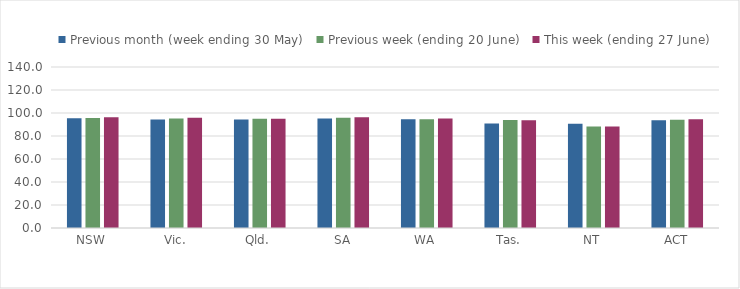
| Category | Previous month (week ending 30 May) | Previous week (ending 20 June) | This week (ending 27 June) |
|---|---|---|---|
| NSW | 95.404 | 95.61 | 96.217 |
| Vic. | 94.378 | 95.317 | 95.972 |
| Qld. | 94.382 | 94.968 | 94.948 |
| SA | 95.183 | 95.962 | 96.258 |
| WA | 94.659 | 94.659 | 95.127 |
| Tas. | 90.877 | 94.018 | 93.712 |
| NT | 90.548 | 88.331 | 88.313 |
| ACT | 93.701 | 94.038 | 94.542 |